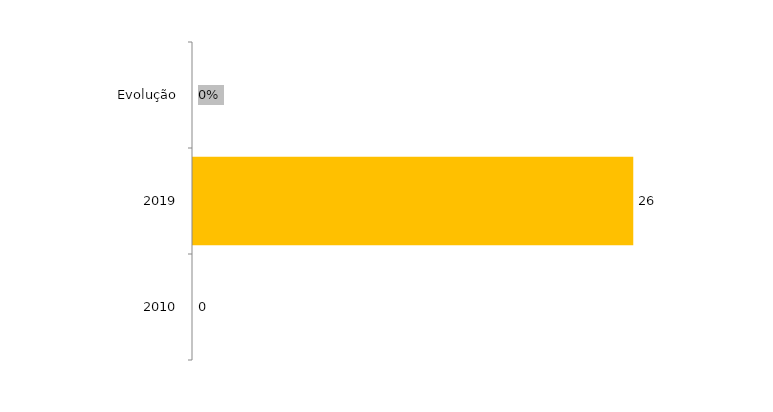
| Category | Evolução Concluintes |
|---|---|
| 2010 | 0 |
| 2019 | 26 |
| Evolução | 0 |